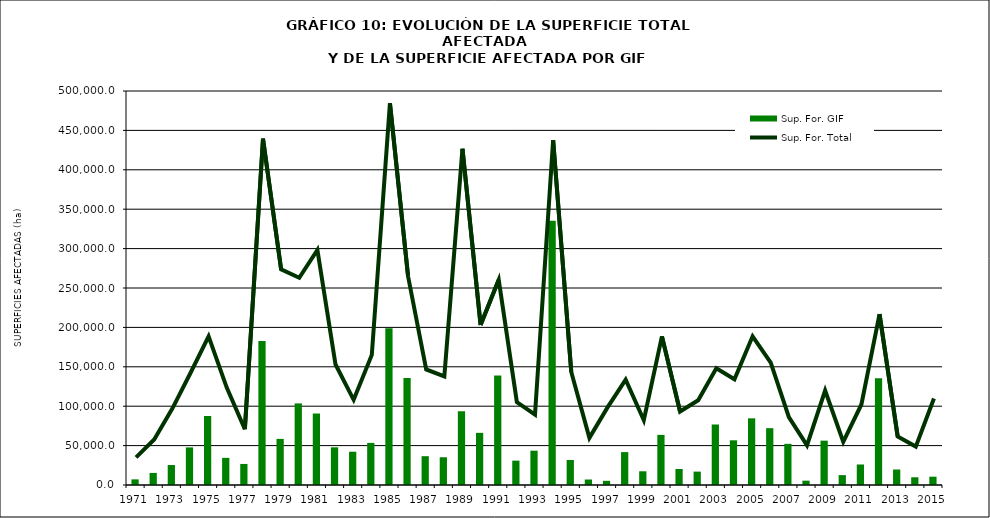
| Category | Sup. For. GIF |
|---|---|
| 1971.0 | 7138 |
| 1972.0 | 15303 |
| 1973.0 | 25341.9 |
| 1974.0 | 47718 |
| 1975.0 | 87535 |
| 1976.0 | 34450 |
| 1977.0 | 26717.5 |
| 1978.0 | 182614.8 |
| 1979.0 | 58497.2 |
| 1980.0 | 103550 |
| 1981.0 | 90711 |
| 1982.0 | 47821.7 |
| 1983.0 | 42239.3 |
| 1984.0 | 53410.7 |
| 1985.0 | 198994.8 |
| 1986.0 | 135756 |
| 1987.0 | 36562.9 |
| 1988.0 | 35205 |
| 1989.0 | 93592.6 |
| 1990.0 | 66183.8 |
| 1991.0 | 138928.1 |
| 1992.0 | 30918.6 |
| 1993.0 | 43532.3 |
| 1994.0 | 335359.2 |
| 1995.0 | 31699.8 |
| 1996.0 | 6962.4 |
| 1997.0 | 5309.4 |
| 1998.0 | 41761.62 |
| 1999.0 | 17399.05 |
| 2000.0 | 63634.69 |
| 2001.0 | 20325.2 |
| 2002.0 | 16993.35 |
| 2003.0 | 76796.21 |
| 2004.0 | 56725.8 |
| 2005.0 | 84605.76 |
| 2006.0 | 72119.08 |
| 2007.0 | 52233.72 |
| 2008.0 | 5499.74 |
| 2009.0 | 56266.49 |
| 2010.0 | 12538.79 |
| 2011.0 | 26034.47 |
| 2012.0 | 135579.9 |
| 2013.0 | 19690.12 |
| 2014.0 | 9805.83 |
| 2015.0 | 10534.3 |